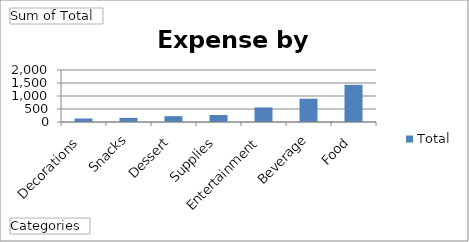
| Category | Total |
|---|---|
| Decorations | 134.4 |
| Snacks | 156.8 |
| Dessert | 224 |
| Supplies | 268.8 |
| Entertainment | 560 |
| Beverage | 896 |
| Food | 1430 |